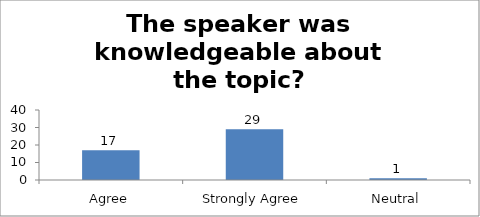
| Category | The speaker was knowledgeable about the topic? |
|---|---|
| Agree | 17 |
| Strongly Agree | 29 |
| Neutral | 1 |